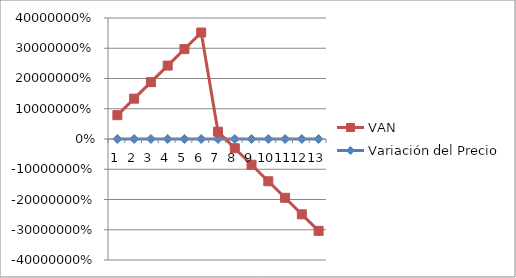
| Category | Variación del Precio | VAN |
|---|---|---|
| 0 | 0.05 | 78793.009 |
| 1 | 0.1 | 133427.591 |
| 2 | 0.15 | 188062.172 |
| 3 | 0.2 | 242696.754 |
| 4 | 0.25 | 297331.336 |
| 5 | 0.3 | 351965.917 |
| 6 | 0 | 24158.428 |
| 7 | -0.05 | -30476.154 |
| 8 | -0.1 | -85110.736 |
| 9 | -0.15 | -139745.317 |
| 10 | -0.2 | -194379.899 |
| 11 | -0.25 | -249014.48 |
| 12 | -0.3 | -303649.062 |